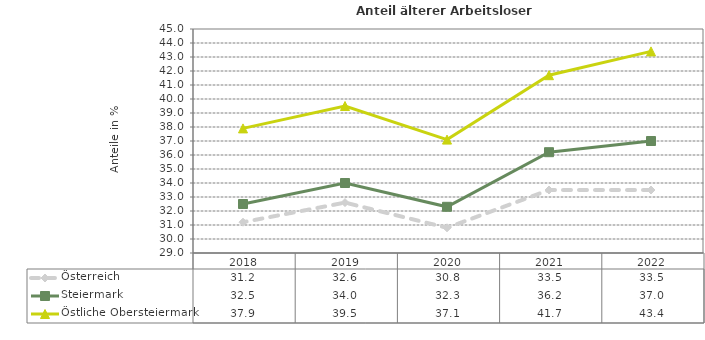
| Category | Österreich | Steiermark | Östliche Obersteiermark |
|---|---|---|---|
| 2022.0 | 33.5 | 37 | 43.4 |
| 2021.0 | 33.5 | 36.2 | 41.7 |
| 2020.0 | 30.8 | 32.3 | 37.1 |
| 2019.0 | 32.6 | 34 | 39.5 |
| 2018.0 | 31.2 | 32.5 | 37.9 |